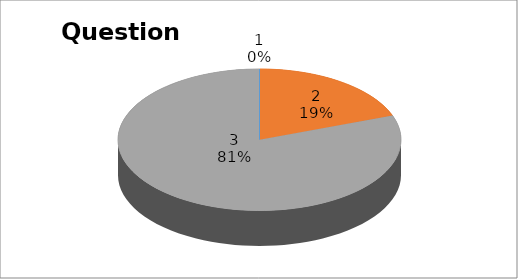
| Category | Series 0 |
|---|---|
| 0 | 0 |
| 1 | 7 |
| 2 | 29 |